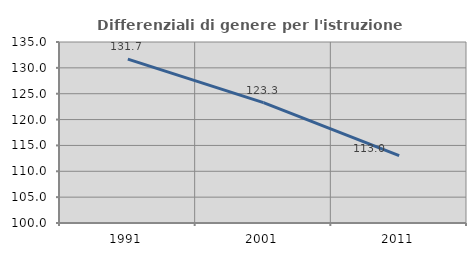
| Category | Differenziali di genere per l'istruzione superiore |
|---|---|
| 1991.0 | 131.696 |
| 2001.0 | 123.281 |
| 2011.0 | 113.018 |